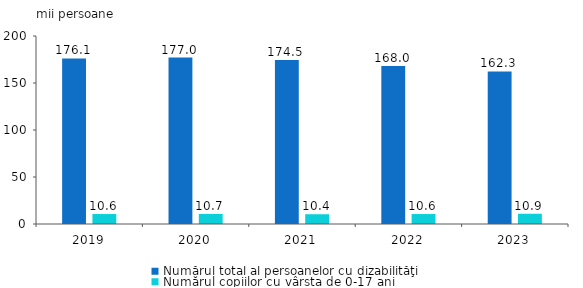
| Category | Numărul total al persoanelor cu dizabilităţi | Numărul copiilor cu vârsta de 0-17 ani |
|---|---|---|
| 2019.0 | 176.1 | 10.6 |
| 2020.0 | 177 | 10.7 |
| 2021.0 | 174.5 | 10.4 |
| 2022.0 | 168 | 10.6 |
| 2023.0 | 162.3 | 10.9 |